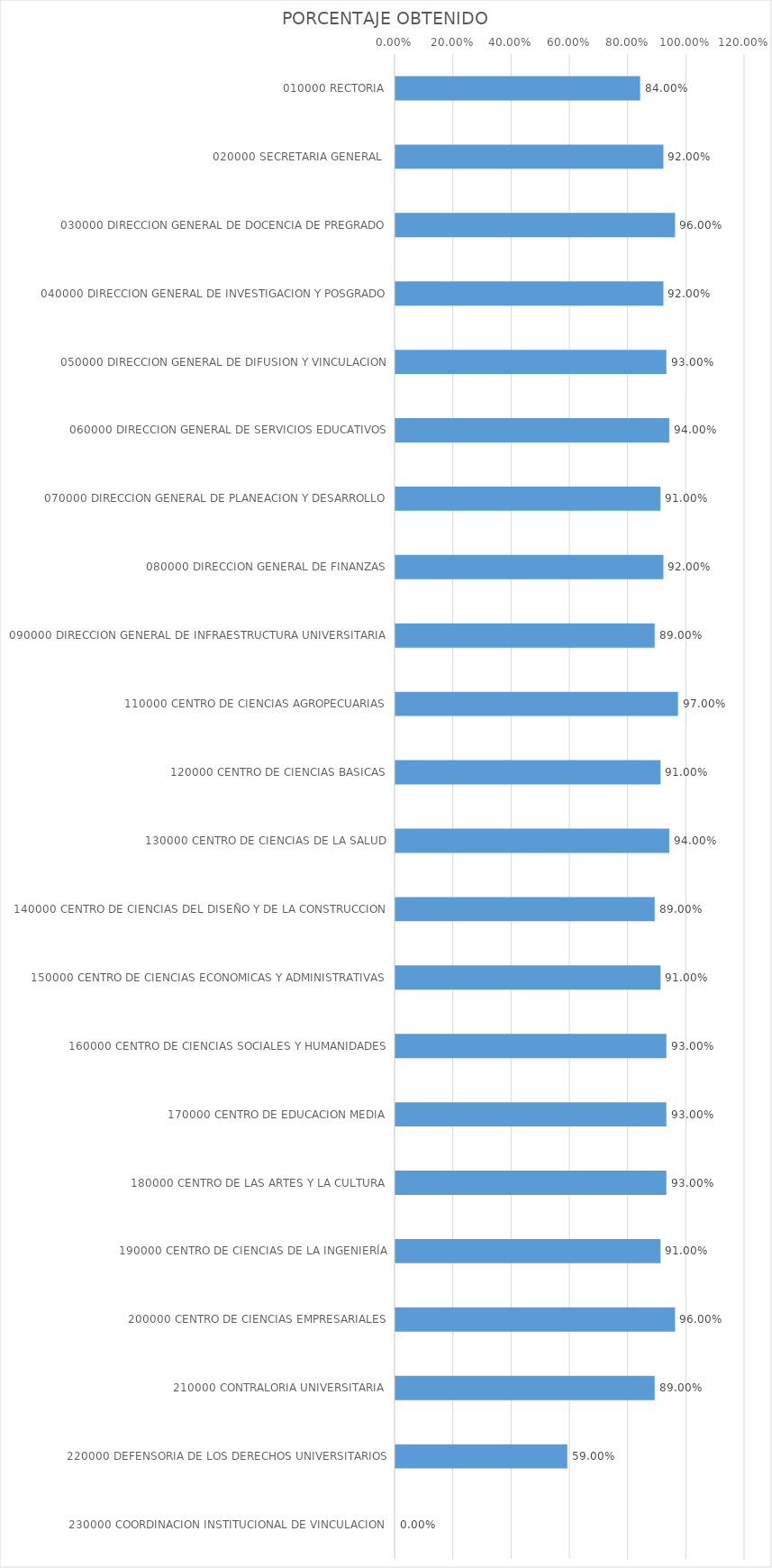
| Category | Series 0 |
|---|---|
| 010000 RECTORIA | 0.84 |
| 020000 SECRETARIA GENERAL  | 0.92 |
| 030000 DIRECCION GENERAL DE DOCENCIA DE PREGRADO | 0.96 |
| 040000 DIRECCION GENERAL DE INVESTIGACION Y POSGRADO | 0.92 |
| 050000 DIRECCION GENERAL DE DIFUSION Y VINCULACION | 0.93 |
| 060000 DIRECCION GENERAL DE SERVICIOS EDUCATIVOS | 0.94 |
| 070000 DIRECCION GENERAL DE PLANEACION Y DESARROLLO | 0.91 |
| 080000 DIRECCION GENERAL DE FINANZAS | 0.92 |
| 090000 DIRECCION GENERAL DE INFRAESTRUCTURA UNIVERSITARIA | 0.89 |
| 110000 CENTRO DE CIENCIAS AGROPECUARIAS | 0.97 |
| 120000 CENTRO DE CIENCIAS BASICAS | 0.91 |
| 130000 CENTRO DE CIENCIAS DE LA SALUD | 0.94 |
| 140000 CENTRO DE CIENCIAS DEL DISEÑO Y DE LA CONSTRUCCION | 0.89 |
| 150000 CENTRO DE CIENCIAS ECONOMICAS Y ADMINISTRATIVAS | 0.91 |
| 160000 CENTRO DE CIENCIAS SOCIALES Y HUMANIDADES | 0.93 |
| 170000 CENTRO DE EDUCACION MEDIA | 0.93 |
| 180000 CENTRO DE LAS ARTES Y LA CULTURA | 0.93 |
| 190000 CENTRO DE CIENCIAS DE LA INGENIERÍA | 0.91 |
| 200000 CENTRO DE CIENCIAS EMPRESARIALES | 0.96 |
| 210000 CONTRALORIA UNIVERSITARIA | 0.89 |
| 220000 DEFENSORIA DE LOS DERECHOS UNIVERSITARIOS | 0.59 |
| 230000 COORDINACION INSTITUCIONAL DE VINCULACION | 0 |